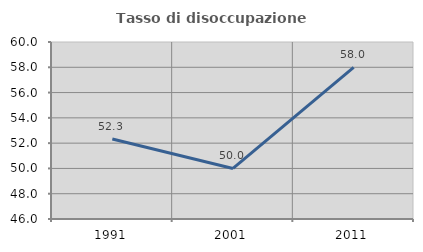
| Category | Tasso di disoccupazione giovanile  |
|---|---|
| 1991.0 | 52.326 |
| 2001.0 | 50 |
| 2011.0 | 58 |